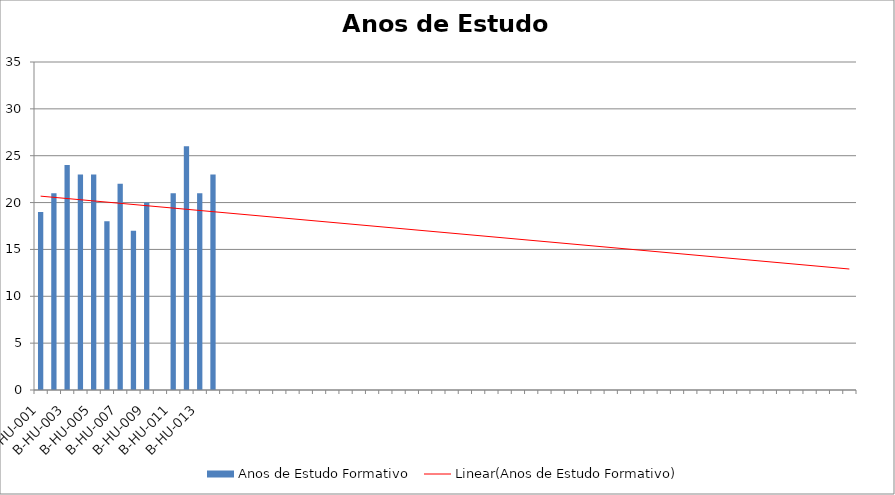
| Category | Anos de Estudo Formativo |
|---|---|
| B-HU-001 | 19 |
| B-HU-002 | 21 |
| B-HU-003 | 24 |
| B-HU-004 | 23 |
| B-HU-005 | 23 |
| B-HU-006 | 18 |
| B-HU-007 | 22 |
| B-HU-008 | 17 |
| B-HU-009 | 20 |
| B-HU-010 | 0 |
| B-HU-011 | 21 |
| B-HU-012 | 26 |
| B-HU-013 | 21 |
| B-HU-014 | 23 |